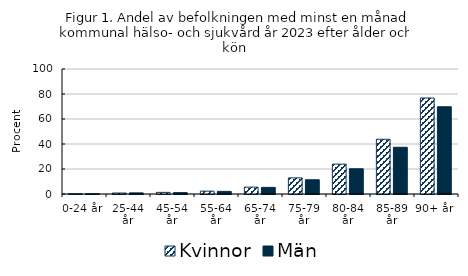
| Category | Kvinnor | Män |
|---|---|---|
| 0-24 år | 0.2 | 0.2 |
| 25-44 år | 0.8 | 0.9 |
| 45-54 år | 1.3 | 1.1 |
| 55-64 år | 2.3 | 2.1 |
| 65-74 år | 5.5 | 5.3 |
| 75-79 år | 12.9 | 11.4 |
| 80-84 år | 23.9 | 20.2 |
| 85-89 år | 43.8 | 37.4 |
| 90+ år | 76.8 | 69.8 |